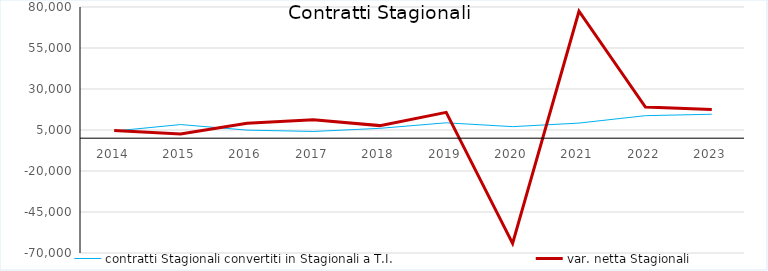
| Category | contratti Stagionali convertiti in Stagionali a T.I. | var. netta Stagionali |
|---|---|---|
| 2014.0 | 4349 | 4624 |
| 2015.0 | 8324 | 2503 |
| 2016.0 | 4924 | 9169 |
| 2017.0 | 4101 | 11288 |
| 2018.0 | 6012 | 7673 |
| 2019.0 | 9391 | 15734 |
| 2020.0 | 7045 | -64191 |
| 2021.0 | 9218 | 77397 |
| 2022.0 | 13746 | 18993 |
| 2023.0 | 14613 | 17555 |